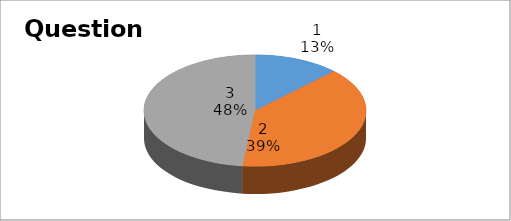
| Category | Series 0 |
|---|---|
| 0 | 7 |
| 1 | 22 |
| 2 | 27 |